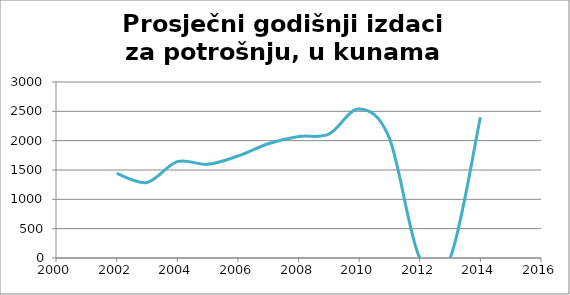
| Category | Prosječni godišnji izdaci za potrošnju, u kunama |
|---|---|
| 2002.0 | 1442 |
| 2003.0 | 1288 |
| 2004.0 | 1642 |
| 2005.0 | 1597 |
| 2006.0 | 1738 |
| 2007.0 | 1948 |
| 2008.0 | 2071 |
| 2009.0 | 2112 |
| 2010.0 | 2539 |
| 2011.0 | 2040 |
| 2012.0 | 0 |
| 2013.0 | 0 |
| 2014.0 | 2400 |